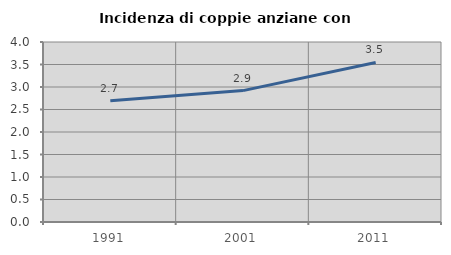
| Category | Incidenza di coppie anziane con figli |
|---|---|
| 1991.0 | 2.692 |
| 2001.0 | 2.92 |
| 2011.0 | 3.546 |